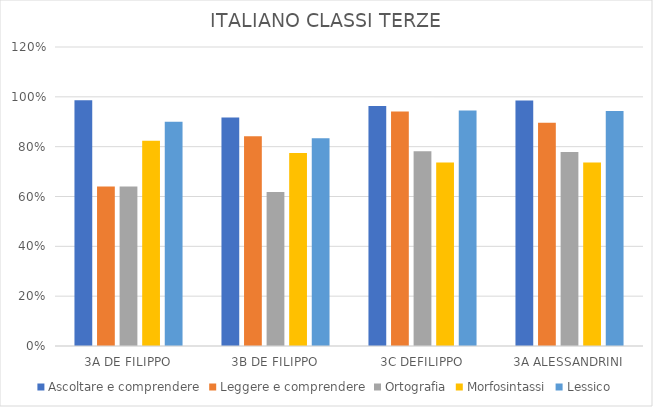
| Category | Ascoltare e comprendere | Leggere e comprendere | Ortografia | Morfosintassi | Lessico |
|---|---|---|---|---|---|
| 3A DE FILIPPO | 0.987 | 0.64 | 0.64 | 0.823 | 0.9 |
| 3B DE FILIPPO | 0.917 | 0.842 | 0.618 | 0.775 | 0.833 |
| 3C DEFILIPPO | 0.964 | 0.941 | 0.782 | 0.736 | 0.945 |
| 3A ALESSANDRINI | 0.986 | 0.896 | 0.779 | 0.736 | 0.943 |